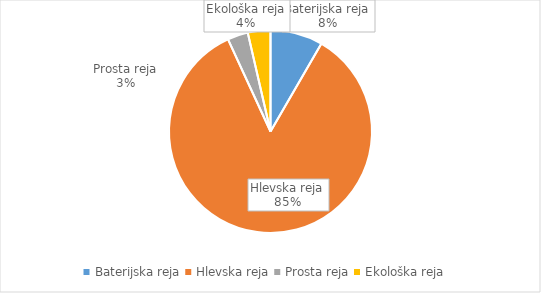
| Category | Količina kosov jajc |
|---|---|
| Baterijska reja | 259979 |
| Hlevska reja | 2639575 |
| Prosta reja | 101815 |
| Ekološka reja | 112274 |